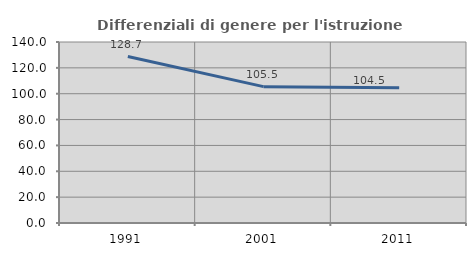
| Category | Differenziali di genere per l'istruzione superiore |
|---|---|
| 1991.0 | 128.742 |
| 2001.0 | 105.482 |
| 2011.0 | 104.538 |